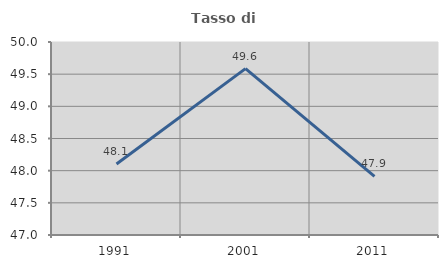
| Category | Tasso di occupazione   |
|---|---|
| 1991.0 | 48.105 |
| 2001.0 | 49.586 |
| 2011.0 | 47.913 |